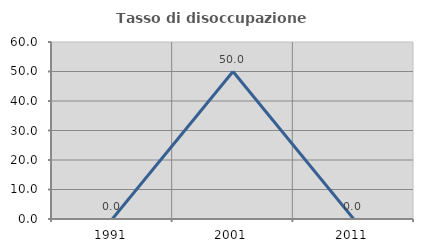
| Category | Tasso di disoccupazione giovanile  |
|---|---|
| 1991.0 | 0 |
| 2001.0 | 50 |
| 2011.0 | 0 |